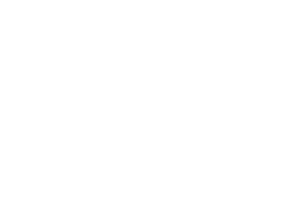
| Category | Series 0 |
|---|---|
| COMP | 0 |
| CON | 0 |
| TET | 0 |
| BAS | 0 |
| Diverse | 0 |